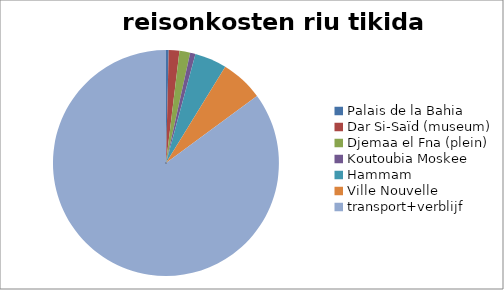
| Category | Series 0 |
|---|---|
| Palais de la Bahia | 5 |
| Dar Si-Saïd (museum) | 20 |
| Djemaa el Fna (plein) | 20 |
| Koutoubia Moskee | 10 |
| Hammam | 60 |
| Ville Nouvelle | 80 |
| transport+verblijf | 1114 |